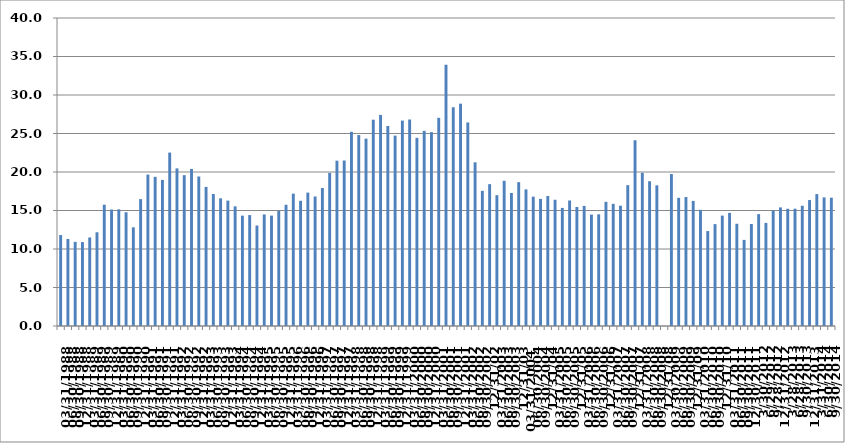
| Category | Series 0 |
|---|---|
| 03/31/1988 | 11.811 |
| 06/30/1988 | 11.302 |
| 09/30/1988 | 10.929 |
| 12/31/1988 | 10.9 |
| 03/31/1989 | 11.5 |
| 06/30/1989 | 12.174 |
| 09/30/1989 | 15.756 |
| 12/31/1989 | 15.128 |
| 03/31/1990 | 15.149 |
| 06/30/1990 | 14.77 |
| 09/30/1990 | 12.816 |
| 12/31/1990 | 16.478 |
| 03/31/1991 | 19.666 |
| 06/30/1991 | 19.372 |
| 09/30/1991 | 18.976 |
| 12/31/1991 | 22.521 |
| 03/31/1992 | 20.471 |
| 06/30/1992 | 19.584 |
| 09/30/1992 | 20.4 |
| 12/31/1992 | 19.417 |
| 03/31/1993 | 18.067 |
| 06/30/1993 | 17.143 |
| 09/30/1993 | 16.58 |
| 12/31/1993 | 16.287 |
| 03/31/1994 | 15.543 |
| 06/30/1994 | 14.331 |
| 09/30/1994 | 14.406 |
| 12/31/1994 | 13.047 |
| 03/31/1995 | 14.488 |
| 06/30/1995 | 14.336 |
| 09/30/1995 | 14.939 |
| 12/31/1995 | 15.745 |
| 03/31/1996 | 17.186 |
| 06/30/1996 | 16.262 |
| 09/30/1996 | 17.322 |
| 12/31/1996 | 16.82 |
| 03/31/1997 | 17.924 |
| 06/30/1997 | 19.882 |
| 09/30/1997 | 21.471 |
| 12/31/1997 | 21.489 |
| 03/31/1998 | 25.223 |
| 06/30/1998 | 24.8 |
| 09/30/1998 | 24.33 |
| 12/31/1998 | 26.792 |
| 03/31/1999 | 27.416 |
| 06/30/1999 | 25.979 |
| 09/30/1999 | 24.725 |
| 12/31/1999 | 26.675 |
| 03/31/2000 | 26.818 |
| 06/30/2000 | 24.439 |
| 09/30/2000 | 25.344 |
| 12/31/2000 | 25.177 |
| 03/31/2001 | 27.035 |
| 06/30/2001 | 33.935 |
| 09/30/2001 | 28.41 |
| 12/31/2001 | 28.875 |
| 03/31/2002 | 26.438 |
| 06/30/2002 | 21.259 |
| 09/30/2002 | 17.556 |
| 12/31/02 | 18.422 |
| 03/31/2003 | 16.991 |
| 06/30/2003 | 18.856 |
| 09/30/2003 | 17.279 |
| 12/31/03 | 18.681 |
| 03/31/2004  | 17.741 |
| 06/30/2004 | 16.797 |
| 09/30/2004 | 16.507 |
| 12/31/04 | 16.879 |
| 03/31/2005 | 16.397 |
| 06/30/2005 | 15.336 |
| 09/30/2005 | 16.306 |
| 12/31/05 | 15.457 |
| 03/31/2006 | 15.6 |
| 06/30/2006 | 14.467 |
| 09/30/2006 | 14.501 |
| 12/31/06 | 16.124 |
| 03/31/2007 | 15.865 |
| 06/30/2007 | 15.621 |
| 09/30/2007 | 18.289 |
| 12/31/07 | 24.119 |
| 03/31/2008 | 19.896 |
| 06/30/2008 | 18.801 |
| 09/30/2008 | 18.27 |
| 12/31/08 | 0 |
| 03/30/2009 | 19.73 |
| 06/30/2009 | 16.642 |
| 09/30/2009 | 16.747 |
| 12/31/09 | 16.246 |
| 03/31/2010 | 15.086 |
| 06/30/2010 | 12.329 |
| 09/30/2010 | 13.233 |
| 12/31/10 | 14.337 |
| 03/31/2011 | 14.692 |
| 06/30/2011 | 13.281 |
| 09/30/2011 | 11.184 |
| 12/30/2011 | 13.249 |
| 3/30/2012 | 14.526 |
| 6/29/2012 | 13.391 |
| 9/28/2012 | 15.007 |
| 12/31/2012 | 15.402 |
| 3/28/2013 | 15.223 |
| 6/28/2013 | 15.234 |
| 9/30/2013 | 15.616 |
| 12/31/2013 | 16.357 |
| 3/31/2014 | 17.133 |
| 6/30/2014 | 16.703 |
| 9/30/2014 | 16.658 |